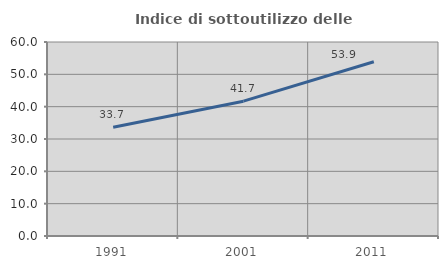
| Category | Indice di sottoutilizzo delle abitazioni  |
|---|---|
| 1991.0 | 33.66 |
| 2001.0 | 41.696 |
| 2011.0 | 53.873 |